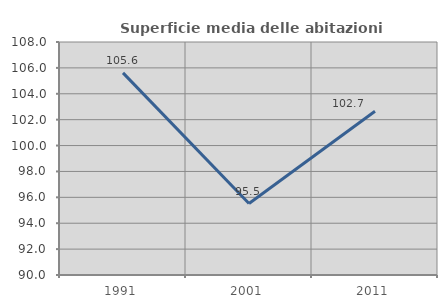
| Category | Superficie media delle abitazioni occupate |
|---|---|
| 1991.0 | 105.614 |
| 2001.0 | 95.523 |
| 2011.0 | 102.653 |